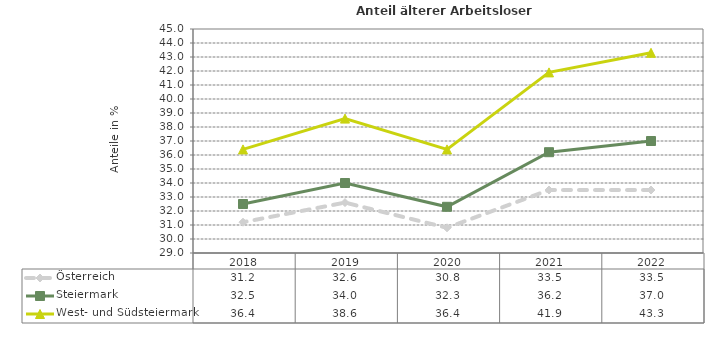
| Category | Österreich | Steiermark | West- und Südsteiermark |
|---|---|---|---|
| 2022.0 | 33.5 | 37 | 43.3 |
| 2021.0 | 33.5 | 36.2 | 41.9 |
| 2020.0 | 30.8 | 32.3 | 36.4 |
| 2019.0 | 32.6 | 34 | 38.6 |
| 2018.0 | 31.2 | 32.5 | 36.4 |